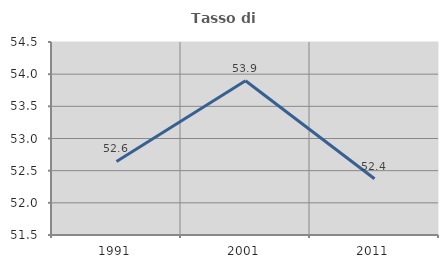
| Category | Tasso di occupazione   |
|---|---|
| 1991.0 | 52.644 |
| 2001.0 | 53.898 |
| 2011.0 | 52.374 |